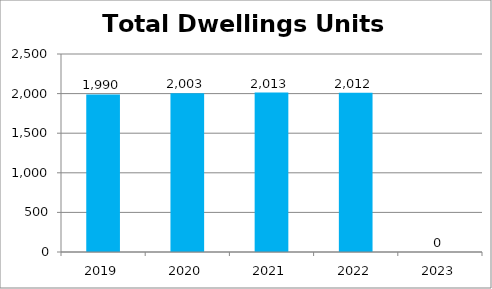
| Category | Total Dwellings Units Served |
|---|---|
| 2019.0 | 1990 |
| 2020.0 | 2003 |
| 2021.0 | 2013 |
| 2022.0 | 2012 |
| 2023.0 | 0 |